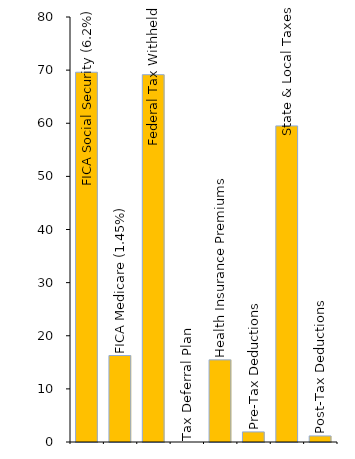
| Category | Series 0 |
|---|---|
| FICA Social Security (6.2%) | 69.604 |
| FICA Medicare (1.45%) | 16.278 |
| Federal Tax Withheld | 69.14 |
| Tax Deferral Plan | 0 |
| Health Insurance Premiums | 15.46 |
| Pre-Tax Deductions | 1.9 |
| State & Local Taxes | 59.5 |
| Post-Tax Deductions | 1.14 |